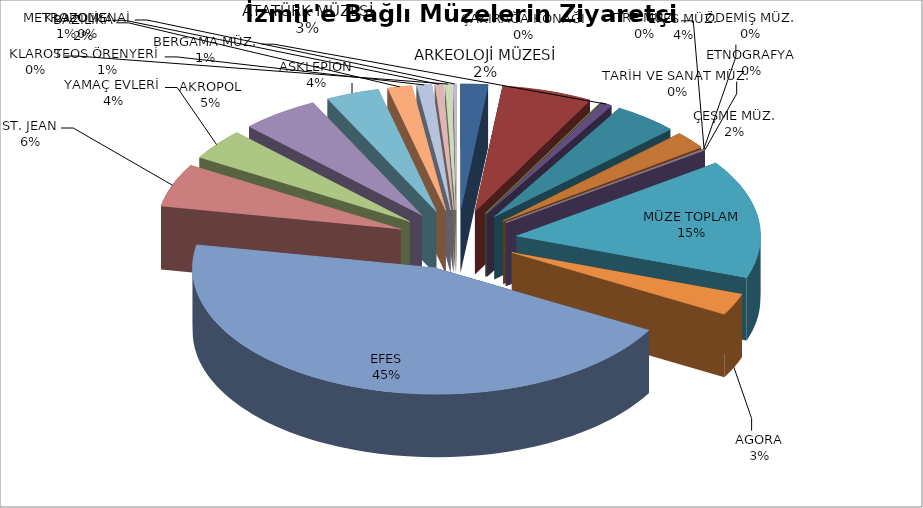
| Category | Series 0 |
|---|---|
| ARKEOLOJİ MÜZESİ | 25233 |
| ATATÜRK MÜZESİ | 84047 |
| TARİH VE SANAT MÜZ. | 235 |
| BERGAMA MÜZ. | 9988 |
| EFES MÜZ. | 59769 |
| ÇEŞME MÜZ. | 31391 |
| ÖDEMİŞ MÜZ. | 538 |
| TİRE MÜZ. | 0 |
| ÇAKIRAĞA KONAĞI | 1134 |
| ETNOGRAFYA | 0 |
| MÜZE TOPLAM | 212335 |
| AGORA | 39004 |
| EFES | 626168 |
| ST. JEAN | 77489 |
| YAMAÇ EVLERİ | 55837 |
| AKROPOL | 72281 |
| ASKLEPİON | 49327 |
| BAZİLİKA | 22469 |
| TEOS ÖRENYERİ | 14057 |
| METROPOLİS | 7553 |
| KLAROS | 6138 |
| KLAZOMENAİ | 3383 |